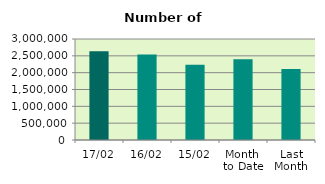
| Category | Series 0 |
|---|---|
| 17/02 | 2638626 |
| 16/02 | 2539686 |
| 15/02 | 2231474 |
| Month 
to Date | 2401248.769 |
| Last
Month | 2107310.455 |